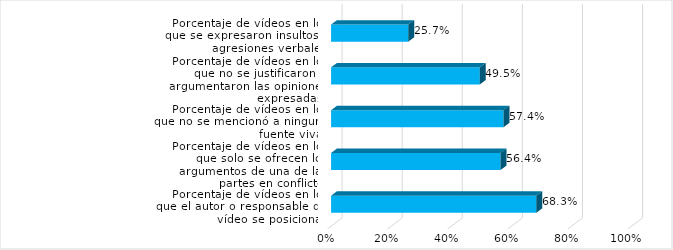
| Category | Series 0 |
|---|---|
| Porcentaje de vídeos en los que el autor o responsable del vídeo se posiciona  | 0.683 |
| Porcentaje de vídeos en los que solo se ofrecen los argumentos de una de las partes en conflicto | 0.564 |
| Porcentaje de vídeos en los que no se mencionó a ninguna fuente viva | 0.574 |
| Porcentaje de vídeos en los que no se justificaron o argumentaron las opiniones expresadas | 0.495 |
| Porcentaje de vídeos en los que se expresaron insultos y agresiones verbales | 0.257 |